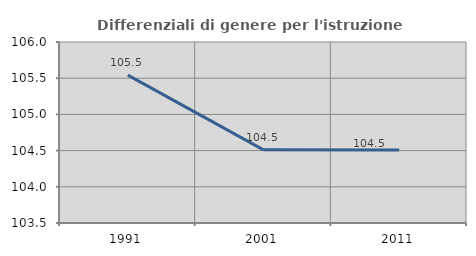
| Category | Differenziali di genere per l'istruzione superiore |
|---|---|
| 1991.0 | 105.542 |
| 2001.0 | 104.511 |
| 2011.0 | 104.508 |